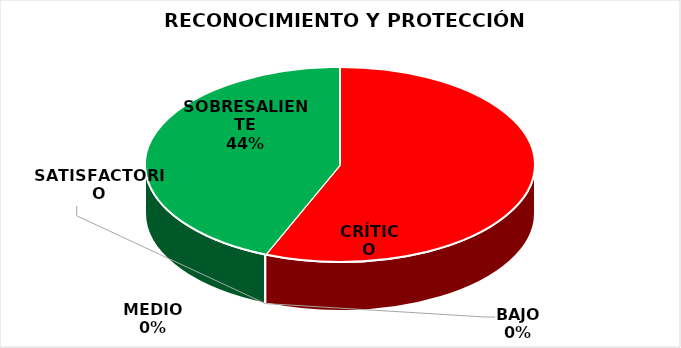
| Category | Series 0 |
|---|---|
| CRÍTICO | 9 |
| BAJO | 0 |
| MEDIO | 0 |
| SATISFACTORIO | 0 |
| SOBRESALIENTE | 7 |